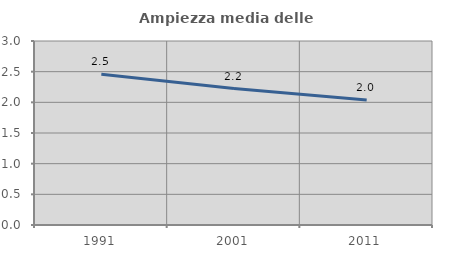
| Category | Ampiezza media delle famiglie |
|---|---|
| 1991.0 | 2.458 |
| 2001.0 | 2.225 |
| 2011.0 | 2.039 |